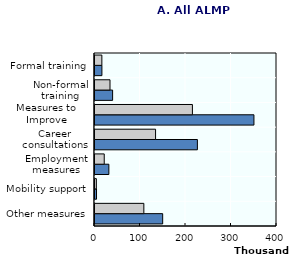
| Category | Participations | Participants |
|---|---|---|
| Other measures | 148753 | 107365 |
| Mobility support | 3340 | 2987 |
| Employment measures | 30487 | 20311 |
| Career consultations | 225045 | 133138 |
| Measures to Improve Competitiveness | 349320 | 214083 |
| Non-formal training | 38706 | 32995 |
| Formal training | 15201 | 15097 |